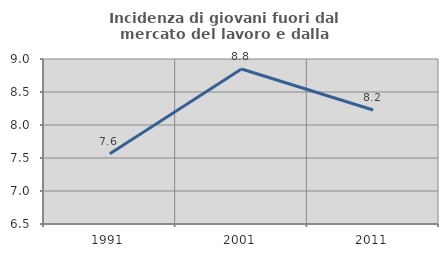
| Category | Incidenza di giovani fuori dal mercato del lavoro e dalla formazione  |
|---|---|
| 1991.0 | 7.563 |
| 2001.0 | 8.849 |
| 2011.0 | 8.226 |